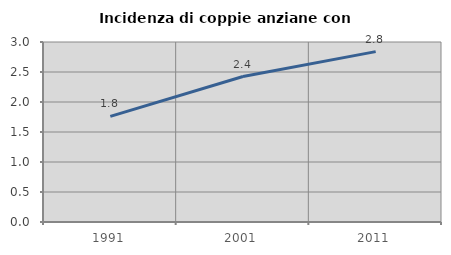
| Category | Incidenza di coppie anziane con figli |
|---|---|
| 1991.0 | 1.76 |
| 2001.0 | 2.424 |
| 2011.0 | 2.84 |